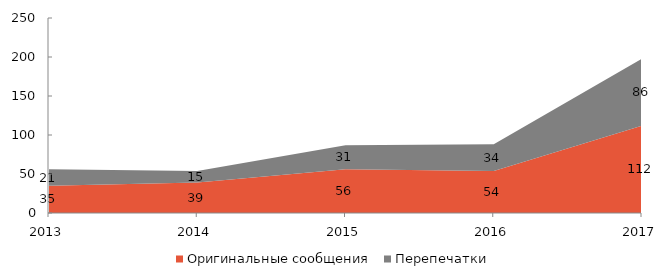
| Category | Оригинальные сообщения | Перепечатки |
|---|---|---|
| 2013 | 35 | 21 |
| 2014 | 39 | 15 |
| 2015 | 56 | 31 |
| 2016 | 54 | 34 |
| 2017 | 112 | 86 |